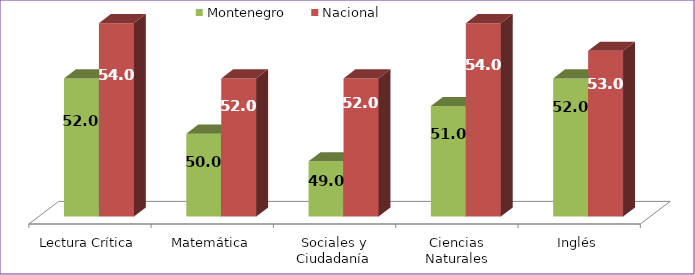
| Category | Montenegro | Nacional |
|---|---|---|
| Lectura Crítica | 52 | 54 |
| Matemática | 50 | 52 |
| Sociales y Ciudadanía | 49 | 52 |
| Ciencias Naturales | 51 | 54 |
| Inglés | 52 | 53 |